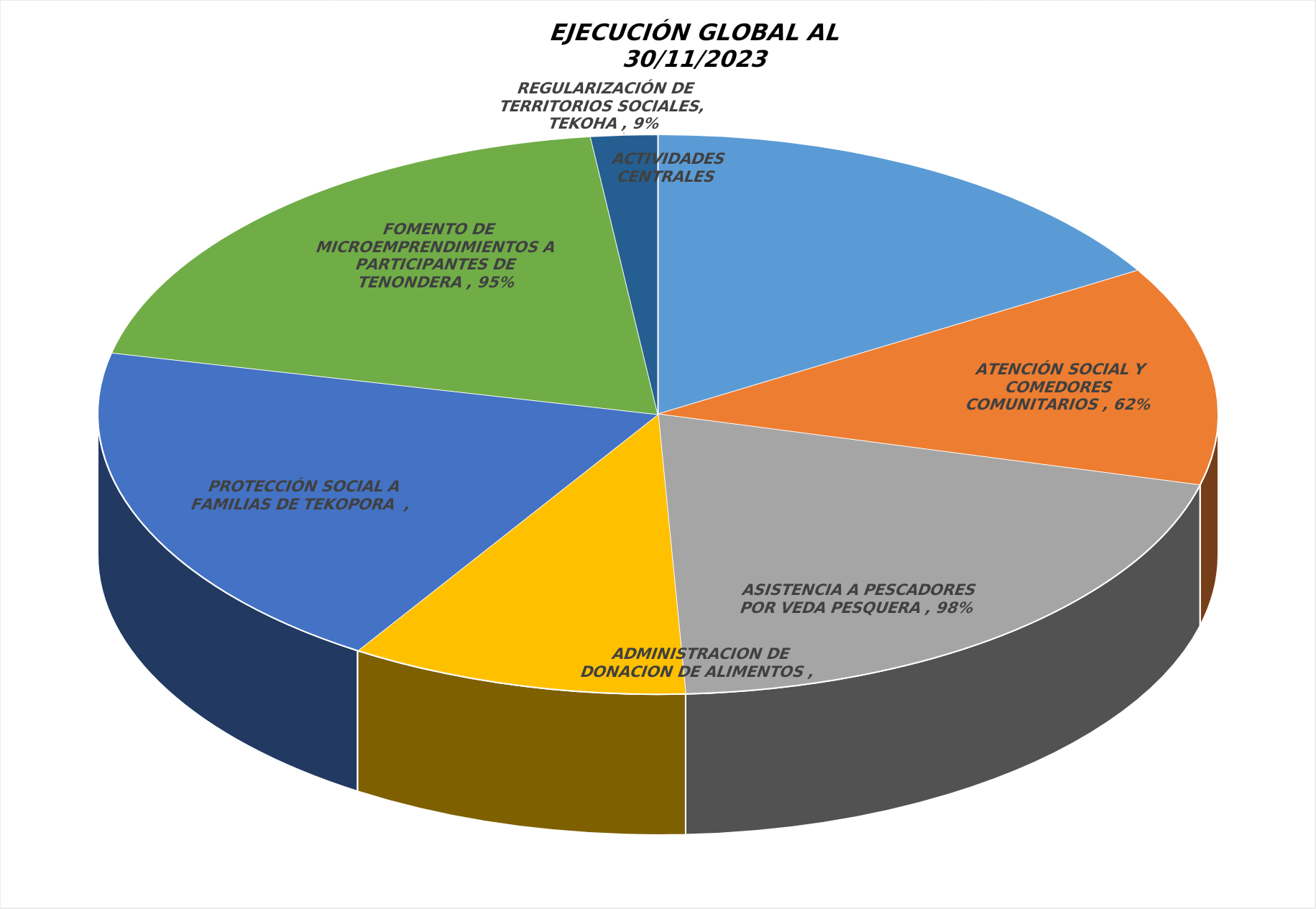
| Category | Series 0 |
|---|---|
| ACTIVIDADES CENTRALES ADMINISTRATIVAS | 0.799 |
| ATENCIÓN SOCIAL Y COMEDORES COMUNITARIOS | 0.617 |
| ASISTENCIA A PESCADORES POR VEDA PESQUERA | 0.981 |
| ADMINISTRACION DE DONACION DE ALIMENTOS | 0.477 |
| PROTECCIÓN SOCIAL A FAMILIAS DE TEKOPORA  | 0.952 |
| FOMENTO DE MICROEMPRENDIMIENTOS A PARTICIPANTES DE TENONDERA | 0.952 |
| REGULARIZACIÓN DE TERRITORIOS SOCIALES, TEKOHA | 0.094 |